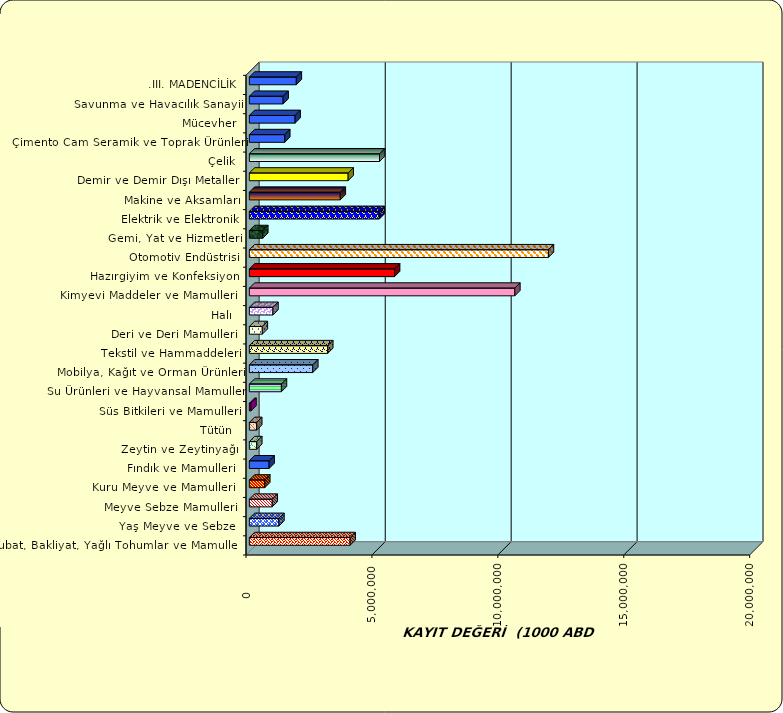
| Category | Series 0 |
|---|---|
|  Hububat, Bakliyat, Yağlı Tohumlar ve Mamulleri  | 4002383.543 |
|  Yaş Meyve ve Sebze   | 1173997.167 |
|  Meyve Sebze Mamulleri  | 908836.063 |
|  Kuru Meyve ve Mamulleri   | 612304.977 |
|  Fındık ve Mamulleri  | 784332.322 |
|  Zeytin ve Zeytinyağı  | 294284.28 |
|  Tütün  | 291653.212 |
|  Süs Bitkileri ve Mamulleri | 63353.321 |
|  Su Ürünleri ve Hayvansal Mamuller | 1273643.433 |
|  Mobilya, Kağıt ve Orman Ürünleri | 2518640.786 |
|  Tekstil ve Hammaddeleri | 3112633.871 |
|  Deri ve Deri Mamulleri  | 515116.978 |
|  Halı  | 937097.636 |
|  Kimyevi Maddeler ve Mamulleri   | 10541276.791 |
|  Hazırgiyim ve Konfeksiyon  | 5766269.567 |
|  Otomotiv Endüstrisi | 11875576.394 |
|  Gemi, Yat ve Hizmetleri | 532762.619 |
|  Elektrik ve Elektronik | 5160696.495 |
|  Makine ve Aksamları | 3611119.927 |
|  Demir ve Demir Dışı Metaller  | 3923010.625 |
|  Çelik | 5169203.292 |
|  Çimento Cam Seramik ve Toprak Ürünleri | 1405967.854 |
|  Mücevher | 1818206.084 |
|  Savunma ve Havacılık Sanayii | 1340776.713 |
| .III. MADENCİLİK | 1865074.923 |